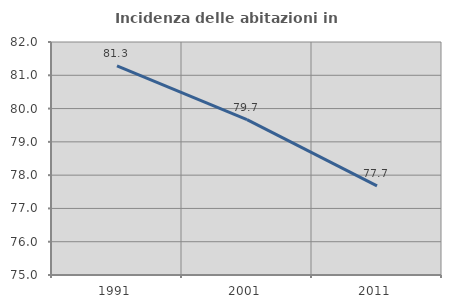
| Category | Incidenza delle abitazioni in proprietà  |
|---|---|
| 1991.0 | 81.285 |
| 2001.0 | 79.668 |
| 2011.0 | 77.677 |